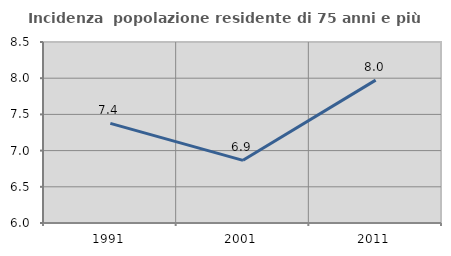
| Category | Incidenza  popolazione residente di 75 anni e più |
|---|---|
| 1991.0 | 7.376 |
| 2001.0 | 6.866 |
| 2011.0 | 7.973 |